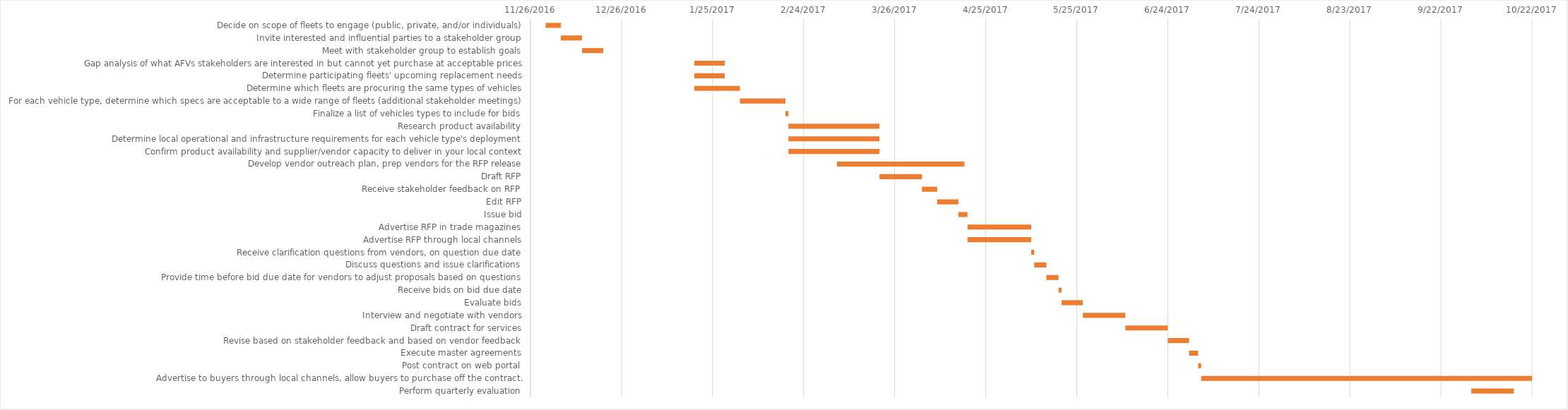
| Category | Start Date | Duration (days) |
|---|---|---|
| Decide on scope of fleets to engage (public, private, and/or individuals) | 12/1/16 | 5 |
| Invite interested and influential parties to a stakeholder group | 12/6/16 | 7 |
| Meet with stakeholder group to establish goals | 12/13/16 | 7 |
| Gap analysis of what AFVs stakeholders are interested in but cannot yet purchase at acceptable prices | 1/19/17 | 10 |
| Determine participating fleets' upcoming replacement needs | 1/19/17 | 10 |
| Determine which fleets are procuring the same types of vehicles | 1/19/17 | 15 |
| For each vehicle type, determine which specs are acceptable to a wide range of fleets (additional stakeholder meetings) | 2/3/17 | 15 |
| Finalize a list of vehicles types to include for bids | 2/18/17 | 1 |
| Research product availability | 2/19/17 | 30 |
| Determine local operational and infrastructure requirements for each vehicle type's deployment | 2/19/17 | 30 |
| Confirm product availability and supplier/vendor capacity to deliver in your local context | 2/19/17 | 30 |
| Develop vendor outreach plan, prep vendors for the RFP release | 3/7/17 | 42 |
| Draft RFP | 3/21/17 | 14 |
| Receive stakeholder feedback on RFP | 4/4/17 | 5 |
| Edit RFP | 4/9/17 | 7 |
| Issue bid | 4/16/17 | 3 |
| Advertise RFP in trade magazines | 4/19/17 | 21 |
| Advertise RFP through local channels | 4/19/17 | 21 |
| Receive clarification questions from vendors, on question due date | 5/10/17 | 1 |
| Discuss questions and issue clarifications | 5/11/17 | 4 |
| Provide time before bid due date for vendors to adjust proposals based on questions | 5/15/17 | 4 |
| Receive bids on bid due date | 5/19/17 | 1 |
| Evaluate bids | 5/20/17 | 7 |
| Interview and negotiate with vendors | 5/27/17 | 14 |
| Draft contract for services | 6/10/17 | 14 |
| Revise based on stakeholder feedback and based on vendor feedback | 6/24/17 | 7 |
| Execute master agreements | 7/1/17 | 3 |
| Post contract on web portal  | 7/4/17 | 1 |
| Advertise to buyers through local channels, allow buyers to purchase off the contract. | 7/5/17 | 365 |
| Perform quarterly evaluation | 10/2/17 | 14 |